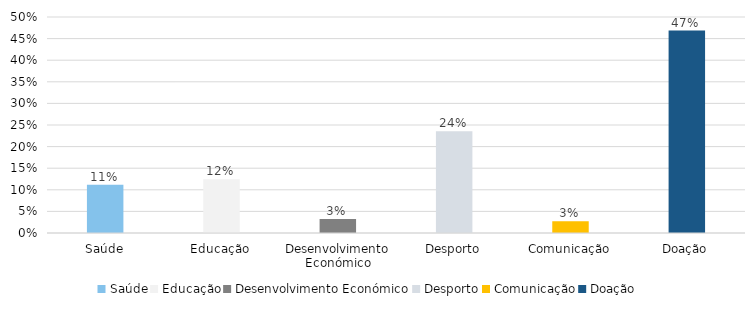
| Category | 2021 |
|---|---|
| Saúde | 0.111 |
| Educação | 0.124 |
| Desenvolvimento Económico | 0.033 |
| Desporto | 0.236 |
| Comunicação | 0.027 |
| Doação | 0.469 |